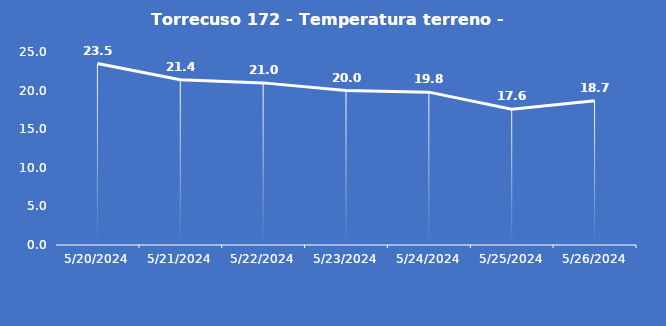
| Category | Torrecuso 172 - Temperatura terreno - Grezzo (°C) |
|---|---|
| 5/20/24 | 23.5 |
| 5/21/24 | 21.4 |
| 5/22/24 | 21 |
| 5/23/24 | 20 |
| 5/24/24 | 19.8 |
| 5/25/24 | 17.6 |
| 5/26/24 | 18.7 |